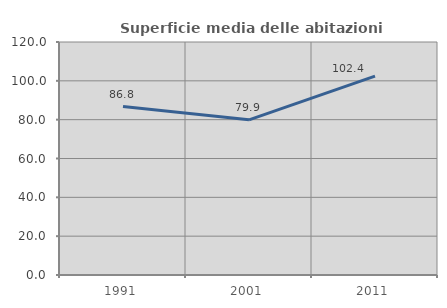
| Category | Superficie media delle abitazioni occupate |
|---|---|
| 1991.0 | 86.762 |
| 2001.0 | 79.919 |
| 2011.0 | 102.449 |